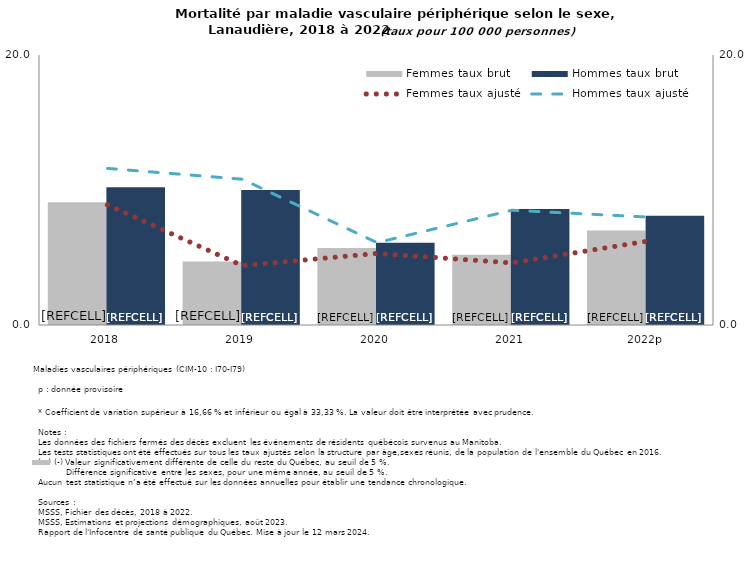
| Category | Femmes taux brut | Hommes taux brut |
|---|---|---|
| 2018 | 9.1 | 10.2 |
| 2019 | 4.7 | 10 |
| 2020 | 5.7 | 6.1 |
| 2021 | 5.2 | 8.6 |
| 2022p | 7 | 8.1 |